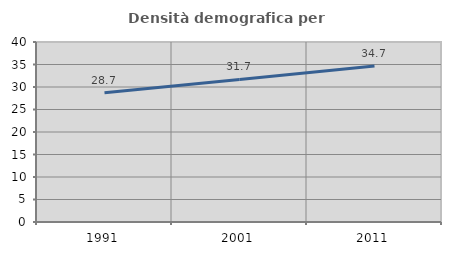
| Category | Densità demografica |
|---|---|
| 1991.0 | 28.721 |
| 2001.0 | 31.69 |
| 2011.0 | 34.65 |